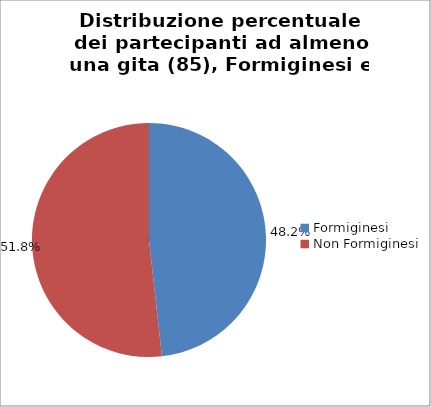
| Category | Nr. Tesserati |
|---|---|
| Formiginesi | 41 |
| Non Formiginesi | 44 |